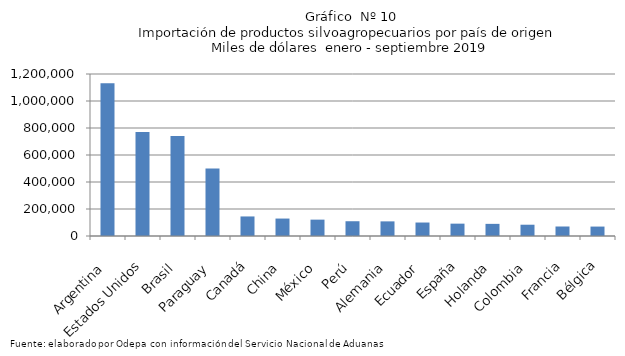
| Category | Series 0 |
|---|---|
| Argentina | 1131270.37 |
| Estados Unidos | 769500.402 |
| Brasil | 741360.606 |
| Paraguay | 500873.838 |
| Canadá | 144830.363 |
| China | 129236.581 |
| México | 121198.826 |
| Perú | 109355.809 |
| Alemania | 108377.067 |
| Ecuador | 99787.718 |
| España | 91499.229 |
| Holanda | 89942.208 |
| Colombia | 83575.287 |
| Francia | 70410.251 |
| Bélgica | 69854.32 |